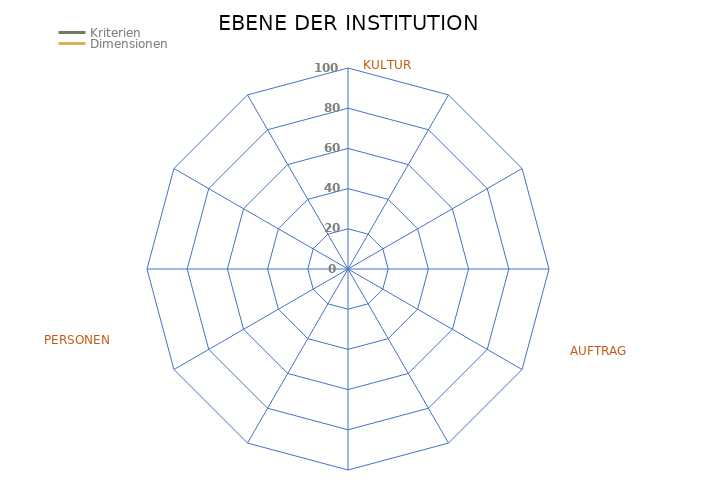
| Category | Kriterien |
|---|---|
| STEUERUNG | 0 |
| STRATEGIE | 0 |
| INTEGR. KONTEXT | 0 |
| MESSUNG | 0 |
| LEHRPLÄNE | 0 |
| FORSCHUNG | 0 |
| REICHWEITE | 0 |
| FINANZIERUNG | 0 |
| IDENTIFIKATION | 0 |
| KONSULTATION | 0 |
| EINBINDUNG | 0 |
| CO-CREATION | 0 |